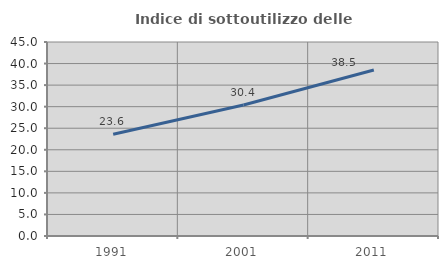
| Category | Indice di sottoutilizzo delle abitazioni  |
|---|---|
| 1991.0 | 23.596 |
| 2001.0 | 30.388 |
| 2011.0 | 38.519 |